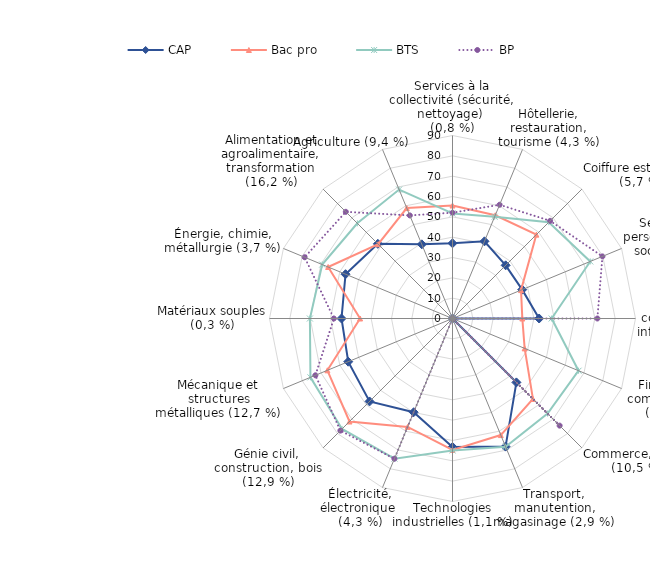
| Category | CAP | Bac pro | BTS | BP |
|---|---|---|---|---|
| Services à la collectivité (sécurité, nettoyage) 
(0,8 %) | 37 | 55.56 | 51.68 | 52.03 |
| Hôtellerie, restauration, tourisme (4,3 %) | 41.09 | 54.97 | 54.14 | 60.55 |
| Coiffure esthétique (5,7 %) | 36.98 | 58.33 | 66.97 | 67.92 |
| Services aux personnes (santé, social) (9,1 %) | 37.09 | 36.47 | 73.32 | 79.81 |
| Secrétariat, communication et information (2,6 %) | 42.61 | 34.34 | 48.77 | 71.25 |
| Finances, comptabilité 
(3,3 %) | 0 | 38.41 | 67.09 | 0 |
| Commerce, vente (10,5 %) | 44.44 | 55.95 | 66.11 | 74.51 |
| Transport, manutention, magasinage (2,9 %) | 68.2 | 62.05 | 68.25 | 0 |
| Technologies industrielles (1,1 %) | 63.16 | 64.66 | 64.9 | 0 |
| Électricité, électronique 
(4,3 %) | 49.89 | 57.7 | 74.59 | 74.65 |
| Génie civil, construction, bois (12,9 %) | 57.69 | 71.64 | 76.81 | 77.98 |
| Mécanique et structures métalliques (12,7 %) | 55.51 | 66.6 | 75.62 | 72.98 |
| Matériaux souples (0,3 %) | 54.59 | 45.45 | 70.13 | 58.33 |
| Énergie, chimie, métallurgie (3,7 %) | 56.94 | 66.21 | 69.35 | 78.71 |
| Alimentation et agroalimentaire, transformation (16,2 %) | 51.93 | 51.68 | 66.2 | 74.2 |
| Agriculture (9,4 %) | 39.49 | 58.79 | 68.62 | 54.87 |